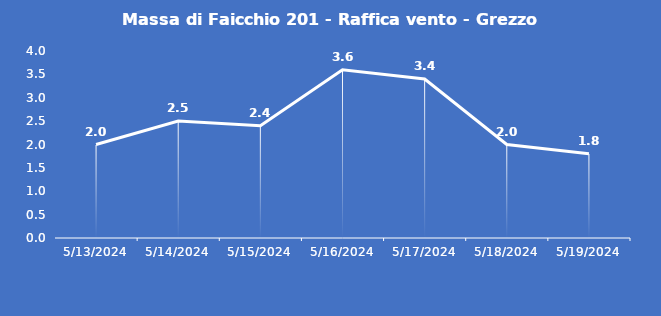
| Category | Massa di Faicchio 201 - Raffica vento - Grezzo (m/s) |
|---|---|
| 5/13/24 | 2 |
| 5/14/24 | 2.5 |
| 5/15/24 | 2.4 |
| 5/16/24 | 3.6 |
| 5/17/24 | 3.4 |
| 5/18/24 | 2 |
| 5/19/24 | 1.8 |